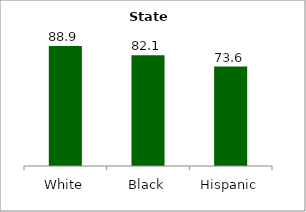
| Category | Series 0 |
|---|---|
| White | 88.886 |
| Black | 82.095 |
| Hispanic | 73.62 |